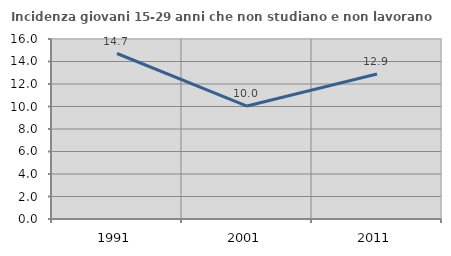
| Category | Incidenza giovani 15-29 anni che non studiano e non lavorano  |
|---|---|
| 1991.0 | 14.711 |
| 2001.0 | 10.04 |
| 2011.0 | 12.892 |